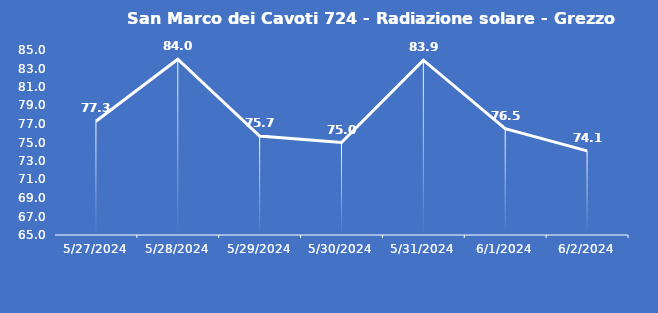
| Category | San Marco dei Cavoti 724 - Radiazione solare - Grezzo (W/m2) |
|---|---|
| 5/27/24 | 77.3 |
| 5/28/24 | 84 |
| 5/29/24 | 75.7 |
| 5/30/24 | 75 |
| 5/31/24 | 83.9 |
| 6/1/24 | 76.5 |
| 6/2/24 | 74.1 |